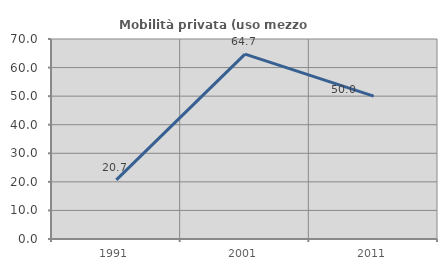
| Category | Mobilità privata (uso mezzo privato) |
|---|---|
| 1991.0 | 20.69 |
| 2001.0 | 64.706 |
| 2011.0 | 50 |